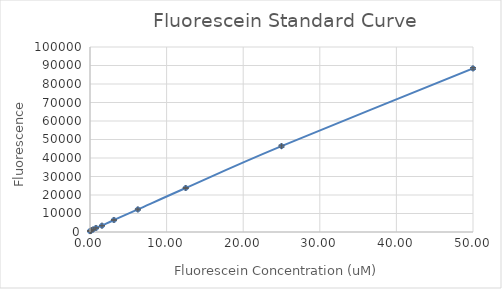
| Category | Series 0 |
|---|---|
| 50.0 | 88434.75 |
| 25.0 | 46409.25 |
| 12.5 | 23787.75 |
| 6.25 | 12197.25 |
| 3.125 | 6486.5 |
| 1.5625 | 3410 |
| 0.78125 | 2177.75 |
| 0.390625 | 1336.5 |
| 0.1953125 | 908.75 |
| 0.09765625 | 676.25 |
| 0.048828125 | 573.5 |
| 0.0 | 469.25 |